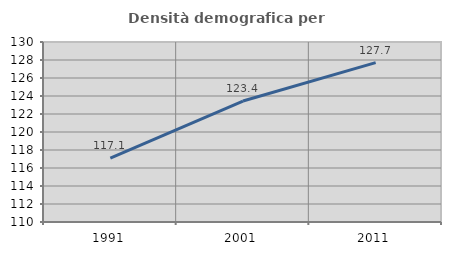
| Category | Densità demografica |
|---|---|
| 1991.0 | 117.089 |
| 2001.0 | 123.438 |
| 2011.0 | 127.705 |